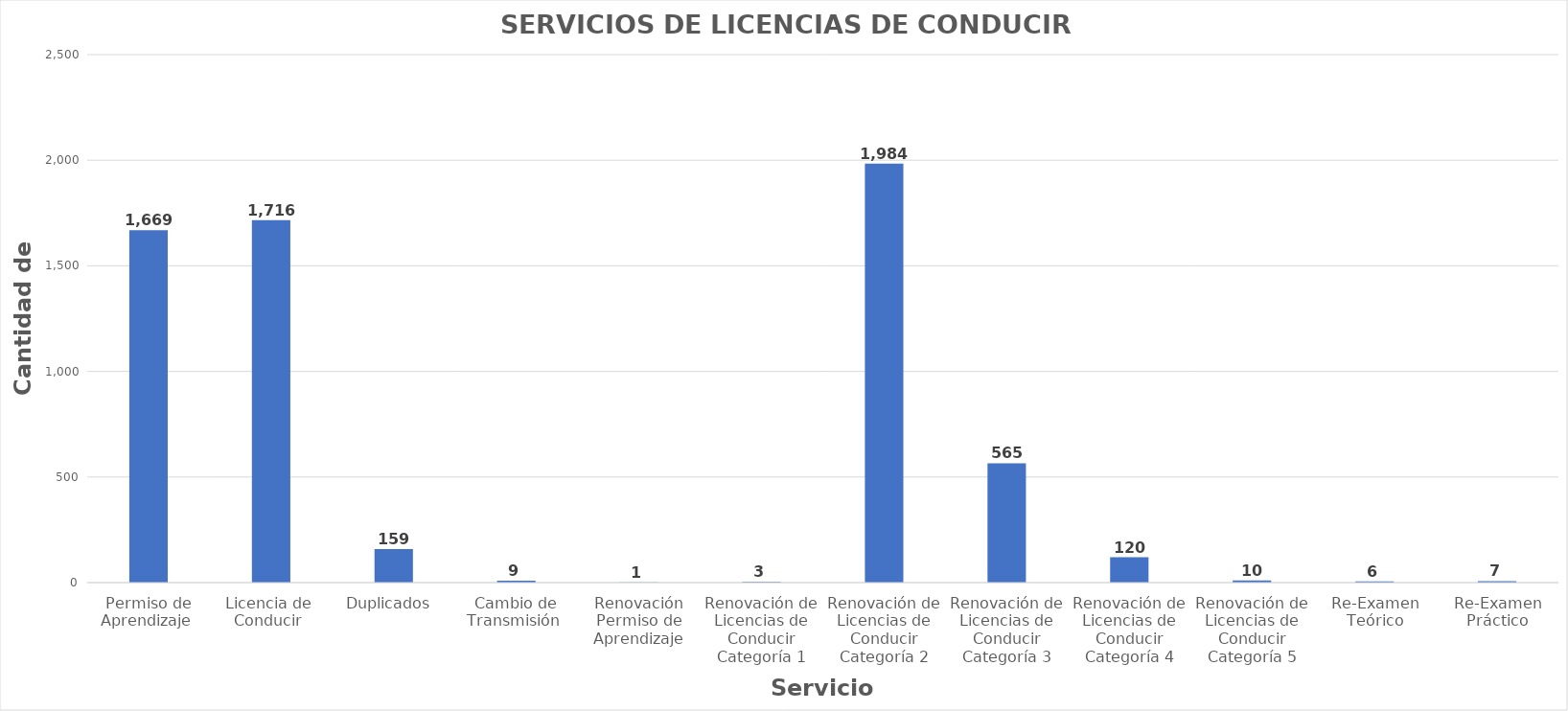
| Category | Series 0 |
|---|---|
| Permiso de Aprendizaje  | 1669 |
| Licencia de  Conducir  | 1716 |
| Duplicados  | 159 |
| Cambio de Transmisión  | 9 |
| Renovación Permiso de Aprendizaje | 1 |
| Renovación de Licencias de Conducir Categoría 1 | 3 |
| Renovación de Licencias de Conducir Categoría 2 | 1984 |
| Renovación de Licencias de Conducir Categoría 3 | 565 |
| Renovación de Licencias de Conducir Categoría 4 | 120 |
| Renovación de Licencias de Conducir Categoría 5 | 10 |
| Re-Examen Teórico | 6 |
| Re-Examen Práctico | 7 |